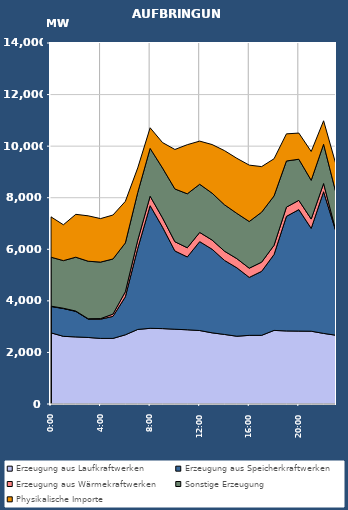
| Category | Erzeugung aus Laufkraftwerken | Erzeugung aus Speicherkraftwerken | Erzeugung aus Wärmekraftwerken | Sonstige Erzeugung | Physikalische Importe |
|---|---|---|---|---|---|
| 2007-01-17 | 2758.996 | 1023.197 | 12.655 | 1899.252 | 1562.981 |
| 2007-01-17 01:00:00 | 2624.802 | 1076.517 | 12.785 | 1846.117 | 1391.121 |
| 2007-01-17 02:00:00 | 2601.653 | 990.854 | 12.718 | 2087.8 | 1662.417 |
| 2007-01-17 03:00:00 | 2580.745 | 713.632 | 12.644 | 2230.18 | 1760.725 |
| 2007-01-17 04:00:00 | 2543.302 | 746.216 | 21.51 | 2192.234 | 1686.521 |
| 2007-01-17 05:00:00 | 2543.897 | 853.441 | 89.469 | 2136.946 | 1704.825 |
| 2007-01-17 06:00:00 | 2683.431 | 1473.037 | 197.963 | 1891.842 | 1612.505 |
| 2007-01-17 07:00:00 | 2892.085 | 3143.99 | 318.33 | 1850.579 | 952.605 |
| 2007-01-17 08:00:00 | 2934.992 | 4756.523 | 366.486 | 1854.225 | 800.392 |
| 2007-01-17 09:00:00 | 2923.799 | 3934.408 | 359.614 | 1934.011 | 987.462 |
| 2007-01-17 10:00:00 | 2899.67 | 3035.574 | 357.631 | 2046.342 | 1531.314 |
| 2007-01-17 11:00:00 | 2878.317 | 2824.45 | 356.611 | 2093.053 | 1904.268 |
| 2007-01-17 12:00:00 | 2849.736 | 3447.101 | 356.589 | 1868.02 | 1673.269 |
| 2007-01-17 13:00:00 | 2759.637 | 3243.456 | 356.007 | 1817.859 | 1885.008 |
| 2007-01-17 14:00:00 | 2697.344 | 2872.561 | 357.156 | 1800.113 | 2099.234 |
| 2007-01-17 15:00:00 | 2628.221 | 2653.861 | 355.208 | 1754.852 | 2136.447 |
| 2007-01-17 16:00:00 | 2662.541 | 2247.175 | 356.576 | 1811.177 | 2186.089 |
| 2007-01-17 17:00:00 | 2663.629 | 2481.545 | 355.927 | 1937.78 | 1767.653 |
| 2007-01-17 18:00:00 | 2854.141 | 2943.457 | 356.578 | 1915.145 | 1441.659 |
| 2007-01-17 19:00:00 | 2833.449 | 4443.307 | 358.492 | 1789.167 | 1051.68 |
| 2007-01-17 20:00:00 | 2827.195 | 4711.317 | 359.044 | 1595.307 | 1014.293 |
| 2007-01-17 21:00:00 | 2822.607 | 3987.974 | 361.836 | 1503.81 | 1116.381 |
| 2007-01-17 22:00:00 | 2737.626 | 5494.404 | 319.063 | 1523.278 | 909.233 |
| 2007-01-17 23:00:00 | 2665.798 | 4015.038 | 13.189 | 1490.978 | 1099.521 |